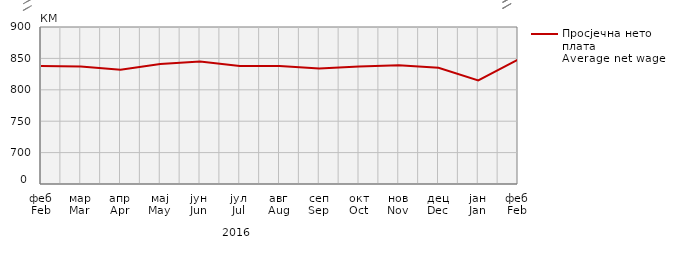
| Category | Просјечна нето плата
Average net wage |
|---|---|
| феб
Feb | 838 |
| мар
Mar | 837 |
| апр
Apr | 832 |
| мај
May | 841 |
| јун
Jun | 845 |
| јул
Jul | 838 |
| авг
Aug | 838 |
| сеп
Sep | 834 |
| окт
Oct | 837 |
| нов
Nov | 839 |
| дец
Dec | 835 |
| јан
Jan | 815 |
| феб
Feb | 848 |